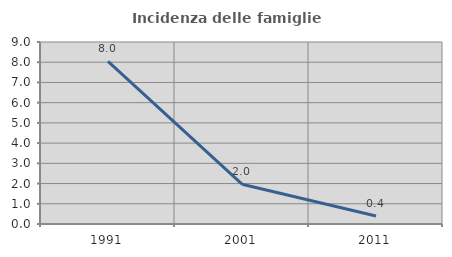
| Category | Incidenza delle famiglie numerose |
|---|---|
| 1991.0 | 8.04 |
| 2001.0 | 1.97 |
| 2011.0 | 0.392 |